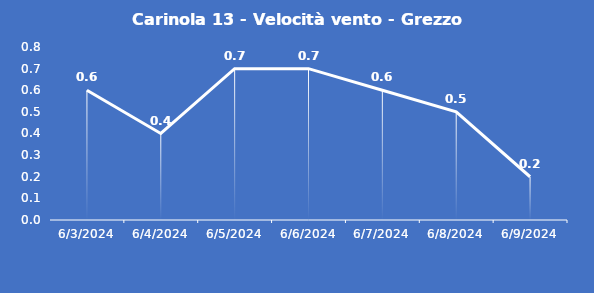
| Category | Carinola 13 - Velocità vento - Grezzo (m/s) |
|---|---|
| 6/3/24 | 0.6 |
| 6/4/24 | 0.4 |
| 6/5/24 | 0.7 |
| 6/6/24 | 0.7 |
| 6/7/24 | 0.6 |
| 6/8/24 | 0.5 |
| 6/9/24 | 0.2 |